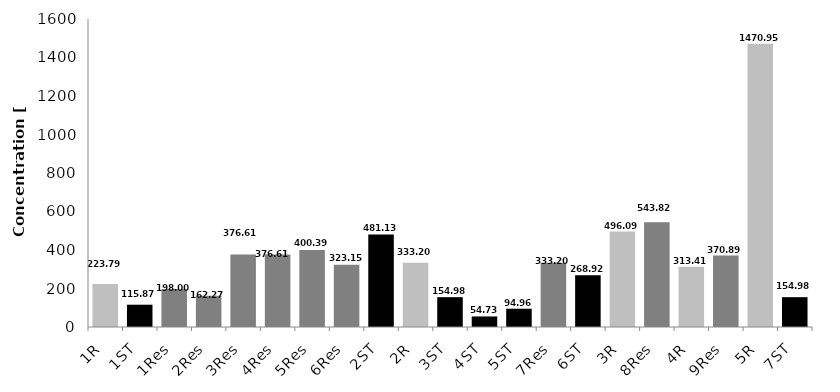
| Category | Concentrations of dioxins |
|---|---|
| 1R | 223.794 |
| 1ST | 115.869 |
| 1Res | 197.998 |
| 2Res | 162.268 |
| 3Res | 376.611 |
| 4Res | 376.611 |
| 5Res | 400.392 |
| 6Res | 323.153 |
| 2ST | 481.134 |
| 2R | 333.2 |
| 3ST | 154.984 |
| 4ST | 54.727 |
| 5ST | 94.96 |
| 7Res | 333.2 |
| 6ST | 268.923 |
| 3R | 496.093 |
| 8Res | 543.818 |
| 4R | 313.409 |
| 9Res | 370.889 |
| 5R | 1470.947 |
| 7ST | 154.984 |